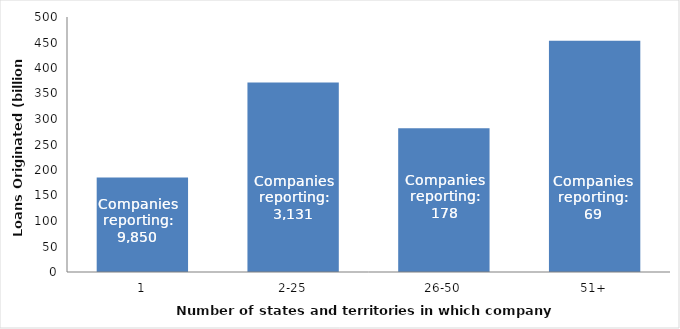
| Category | Loans originated |
|---|---|
| 1 | 185230692169 |
| 2-25 | 371527577656 |
| 26-50 | 281768279623 |
| 51+ | 453559335097 |